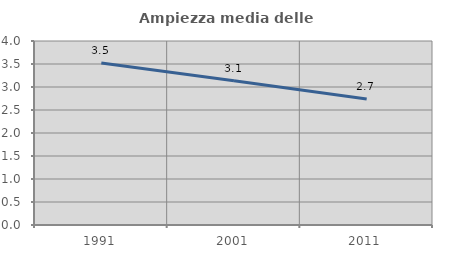
| Category | Ampiezza media delle famiglie |
|---|---|
| 1991.0 | 3.524 |
| 2001.0 | 3.138 |
| 2011.0 | 2.739 |